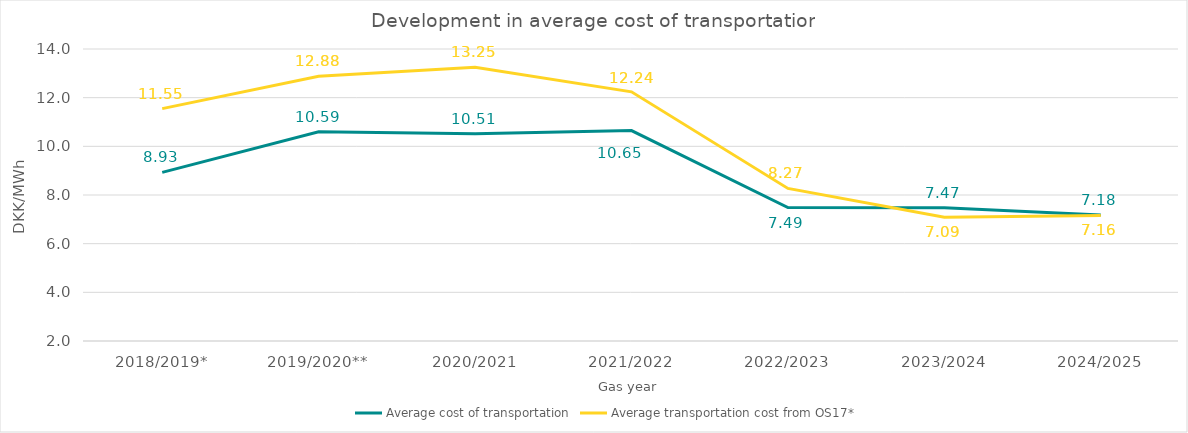
| Category | Average cost of transportation | Average transportation cost from OS17* |
|---|---|---|
| 2018/2019* | 8.93 | 11.55 |
| 2019/2020** | 10.595 | 12.88 |
| 2020/2021 | 10.512 | 13.25 |
| 2021/2022 | 10.648 | 12.24 |
| 2022/2023 | 7.486 | 8.27 |
| 2023/2024 | 7.472 | 7.09 |
| 2024/2025 | 7.181 | 7.16 |